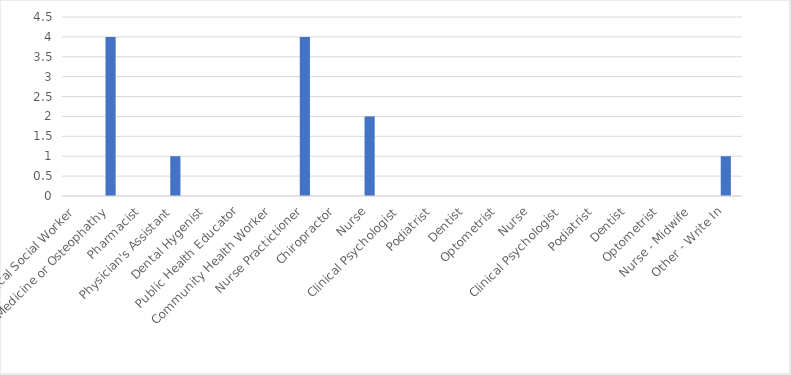
| Category | Number of Responses |
|---|---|
| Clinical Social Worker | 0 |
| Doctor of Medicine or Osteophathy | 4 |
| Pharmacist | 0 |
| Physician's Assistant | 1 |
| Dental Hygenist | 0 |
| Public Health Educator | 0 |
| Community Health Worker | 0 |
| Nurse Practictioner | 4 |
| Chiropractor | 0 |
| Nurse | 2 |
| Clinical Psychologist | 0 |
| Podiatrist | 0 |
| Dentist | 0 |
| Optometrist | 0 |
| Nurse | 0 |
| Clinical Psychologist | 0 |
| Podiatrist | 0 |
| Dentist | 0 |
| Optometrist | 0 |
| Nurse - Midwife | 0 |
| Other - Write In | 1 |